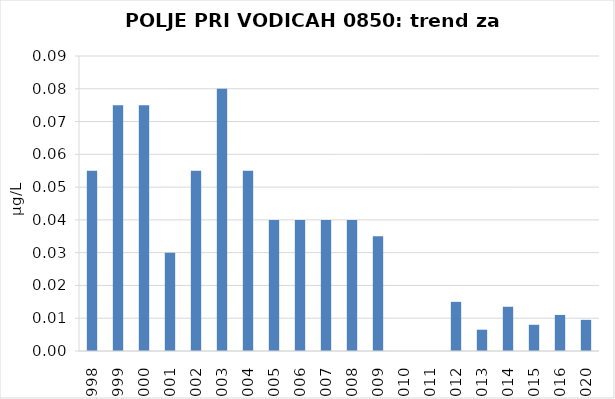
| Category | Vsota |
|---|---|
| 1998 | 0.055 |
| 1999 | 0.075 |
| 2000 | 0.075 |
| 2001 | 0.03 |
| 2002 | 0.055 |
| 2003 | 0.08 |
| 2004 | 0.055 |
| 2005 | 0.04 |
| 2006 | 0.04 |
| 2007 | 0.04 |
| 2008 | 0.04 |
| 2009 | 0.035 |
| 2010 | 0 |
| 2011 | 0 |
| 2012 | 0.015 |
| 2013 | 0.006 |
| 2014 | 0.014 |
| 2015 | 0.008 |
| 2016 | 0.011 |
| 2020 | 0.01 |